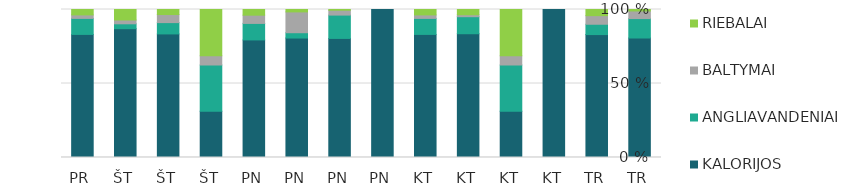
| Category | KALORIJOS | ANGLIAVANDENIAI | BALTYMAI | RIEBALAI |
|---|---|---|---|---|
| TR | 283 | 46 | 18 | 3.5 |
| TR | 500 | 42 | 35 | 25 |
| KT | 1 | 0 | 0 | 0 |
| KT | 10 | 10 | 2 | 10 |
| KT | 189 | 26 | 3 | 8 |
| KT | 477 | 62 | 13.5 | 21 |
| PN | 1 | 0 | 0 | 0 |
| PN | 245 | 48 | 10 | 1.5 |
| PN | 247 | 11 | 43 | 5 |
| PN | 456 | 64 | 32 | 22 |
| ŠT | 10 | 10 | 2 | 10 |
| ŠT | 135 | 12.36 | 8.81 | 5.51 |
| ŠT | 184 | 7 | 5.43 | 15 |
| PR | 477 | 62 | 13.5 | 21 |